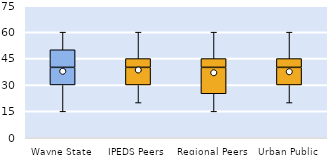
| Category | 25th | 50th | 75th |
|---|---|---|---|
| Wayne State | 30 | 10 | 10 |
| IPEDS Peers | 30 | 10 | 5 |
| Regional Peers | 25 | 15 | 5 |
| Urban Public | 30 | 10 | 5 |